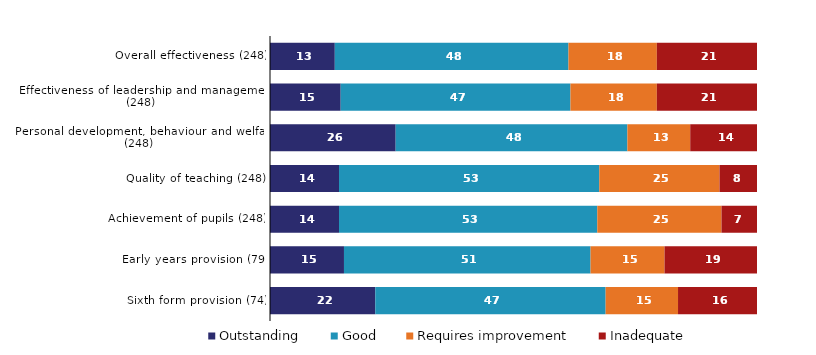
| Category | Outstanding | Good | Requires improvement | Inadequate |
|---|---|---|---|---|
| Overall effectiveness (248) | 13.306 | 47.984 | 18.145 | 20.565 |
| Effectiveness of leadership and management (248) | 14.516 | 47.177 | 17.742 | 20.565 |
| Personal development, behaviour and welfare (248) | 25.806 | 47.581 | 12.903 | 13.71 |
| Quality of teaching (248) | 14.113 | 53.226 | 24.597 | 7.661 |
| Achievement of pupils (248) | 14.113 | 52.823 | 25.403 | 7.258 |
| Early years provision (79) | 15.19 | 50.633 | 15.19 | 18.987 |
| Sixth form provision (74) | 21.622 | 47.297 | 14.865 | 16.216 |